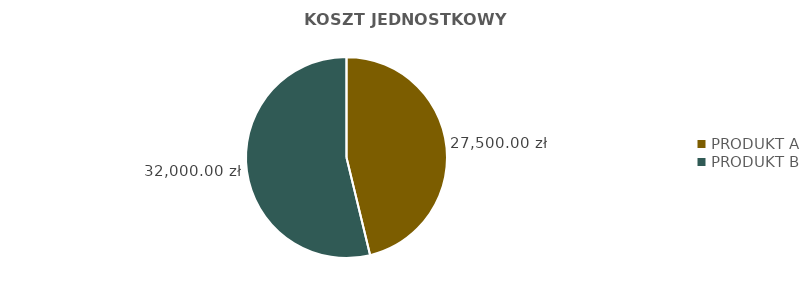
| Category | KOSZT JEDNOSTKOWY PRODUKTU |
|---|---|
| PRODUKT A | 27500 |
| PRODUKT B | 32000 |